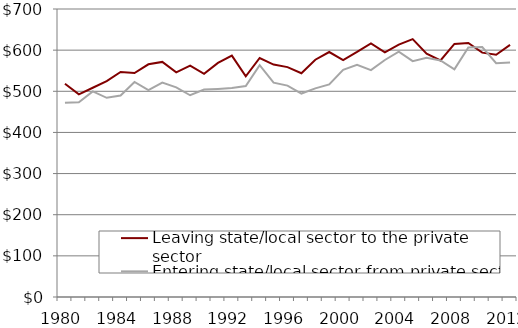
| Category | Leaving state/local sector to the private sector | Entering state/local sector from private sector |
|---|---|---|
| 1980.0 | 518.221 | 472.25 |
| 1981.0 | 492.406 | 473.467 |
| 1982.0 | 508.57 | 499.648 |
| 1983.0 | 524.726 | 484.096 |
| 1984.0 | 547.019 | 489.831 |
| 1985.0 | 544.293 | 522.682 |
| 1986.0 | 565.579 | 502.737 |
| 1987.0 | 571.348 | 521.336 |
| 1988.0 | 546.052 | 509.648 |
| 1989.0 | 562.577 | 490.345 |
| 1990.0 | 542.334 | 504.114 |
| 1991.0 | 568.976 | 505.757 |
| 1992.0 | 586.612 | 508.07 |
| 1993.0 | 536.419 | 512.578 |
| 1994.0 | 580.874 | 563.447 |
| 1995.0 | 565.024 | 520.952 |
| 1996.0 | 558.813 | 513.8 |
| 1997.0 | 543.901 | 494.553 |
| 1998.0 | 576.789 | 507.067 |
| 1999.0 | 595.451 | 516.884 |
| 2000.0 | 576 | 552 |
| 2001.0 | 595.664 | 564.058 |
| 2002.0 | 616.521 | 551.423 |
| 2003.0 | 594.769 | 576.047 |
| 2004.0 | 613.621 | 596.09 |
| 2005.0 | 626.929 | 573.142 |
| 2006.0 | 591.363 | 581.711 |
| 2007.0 | 574.963 | 574.963 |
| 2008.0 | 615.049 | 553.464 |
| 2009.0 | 617.245 | 606.714 |
| 2010.0 | 593.858 | 607.465 |
| 2011.0 | 588.877 | 568.338 |
| 2012.0 | 612.766 | 570.015 |